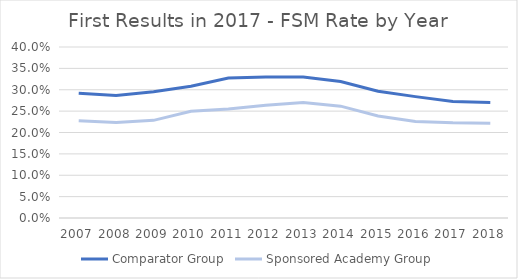
| Category | Comparator Group | Sponsored Academy Group |
|---|---|---|
| 2007.0 | 0.292 | 0.227 |
| 2008.0 | 0.287 | 0.223 |
| 2009.0 | 0.295 | 0.228 |
| 2010.0 | 0.308 | 0.249 |
| 2011.0 | 0.327 | 0.255 |
| 2012.0 | 0.33 | 0.264 |
| 2013.0 | 0.33 | 0.27 |
| 2014.0 | 0.319 | 0.262 |
| 2015.0 | 0.297 | 0.239 |
| 2016.0 | 0.284 | 0.226 |
| 2017.0 | 0.273 | 0.223 |
| 2018.0 | 0.27 | 0.221 |